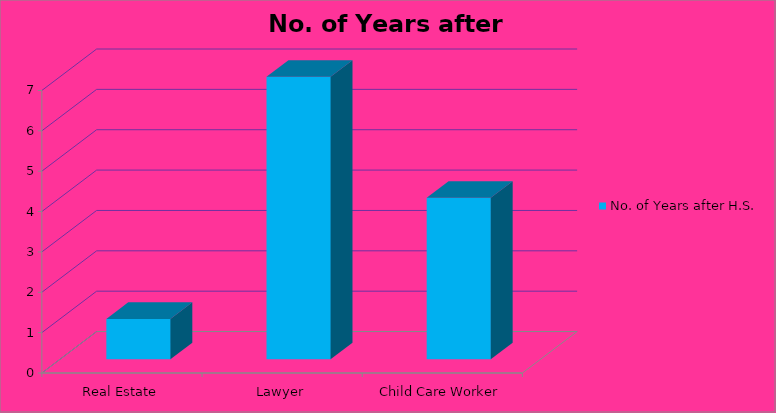
| Category | No. of Years after H.S. |
|---|---|
| Real Estate | 1 |
| Lawyer | 7 |
| Child Care Worker | 4 |